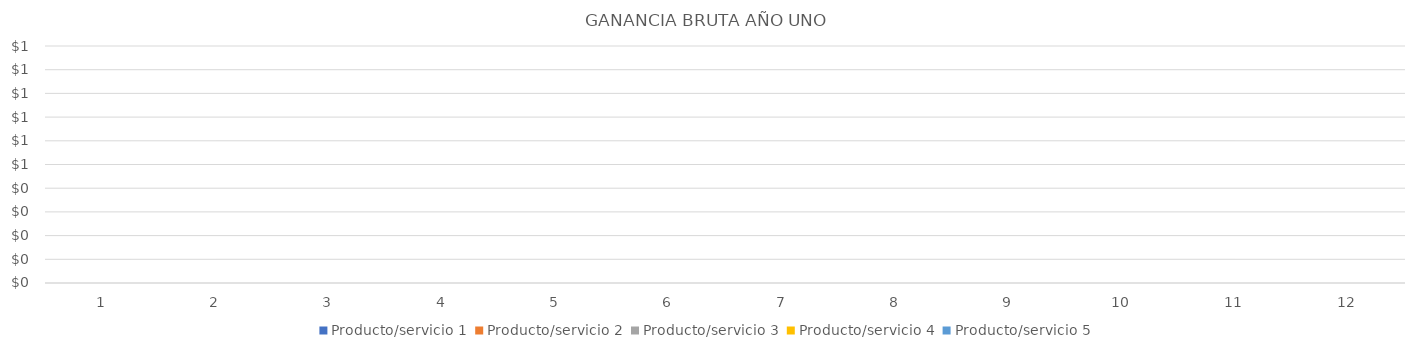
| Category | Producto/servicio 1 | Producto/servicio 2 | Producto/servicio 3 | Producto/servicio 4 | Producto/servicio 5 |
|---|---|---|---|---|---|
| 0 | 0 | 0 | 0 | 0 | 0 |
| 1 | 0 | 0 | 0 | 0 | 0 |
| 2 | 0 | 0 | 0 | 0 | 0 |
| 3 | 0 | 0 | 0 | 0 | 0 |
| 4 | 0 | 0 | 0 | 0 | 0 |
| 5 | 0 | 0 | 0 | 0 | 0 |
| 6 | 0 | 0 | 0 | 0 | 0 |
| 7 | 0 | 0 | 0 | 0 | 0 |
| 8 | 0 | 0 | 0 | 0 | 0 |
| 9 | 0 | 0 | 0 | 0 | 0 |
| 10 | 0 | 0 | 0 | 0 | 0 |
| 11 | 0 | 0 | 0 | 0 | 0 |